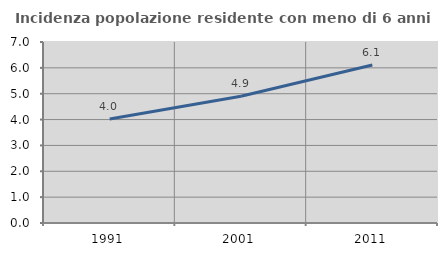
| Category | Incidenza popolazione residente con meno di 6 anni |
|---|---|
| 1991.0 | 4.023 |
| 2001.0 | 4.901 |
| 2011.0 | 6.109 |